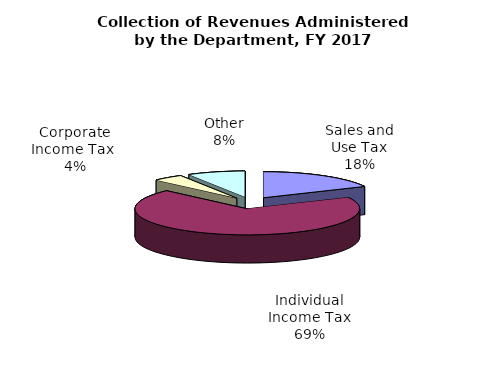
| Category | Series 0 |
|---|---|
| Sales and Use Tax | 3354561000 |
| Individual Income Tax | 13052887000 |
| Corporate Income Tax  | 826961000 |
| Other | 1567321000 |